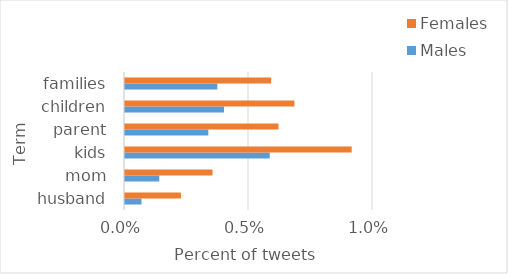
| Category | Males | Females |
|---|---|---|
| husband | 0.001 | 0.002 |
| mom | 0.001 | 0.004 |
| kids | 0.006 | 0.009 |
| parent | 0.003 | 0.006 |
| children | 0.004 | 0.007 |
| families | 0.004 | 0.006 |